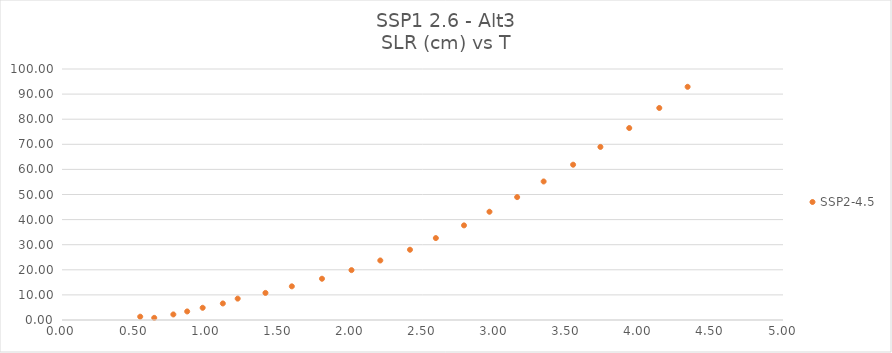
| Category | SSP2-4.5 |
|---|---|
| 0.639593181 | 0.851 |
| 0.542364652 | 1.315 |
| 0.772130534 | 2.215 |
| 0.868150926 | 3.412 |
| 0.975561417 | 4.865 |
| 1.115356613 | 6.592 |
| 1.218373475 | 8.518 |
| 1.410985436 | 10.794 |
| 1.593904848 | 13.413 |
| 1.803019946 | 16.438 |
| 2.007616221 | 19.874 |
| 2.207368083 | 23.717 |
| 2.413259456 | 27.992 |
| 2.592553574 | 32.638 |
| 2.787805632 | 37.699 |
| 2.964502005 | 43.128 |
| 3.15637926 | 48.966 |
| 3.340111123 | 55.194 |
| 3.544440632 | 61.87 |
| 3.733803966 | 68.954 |
| 3.933797593 | 76.48 |
| 4.14214573 | 84.474 |
| 4.338569848 | 92.903 |